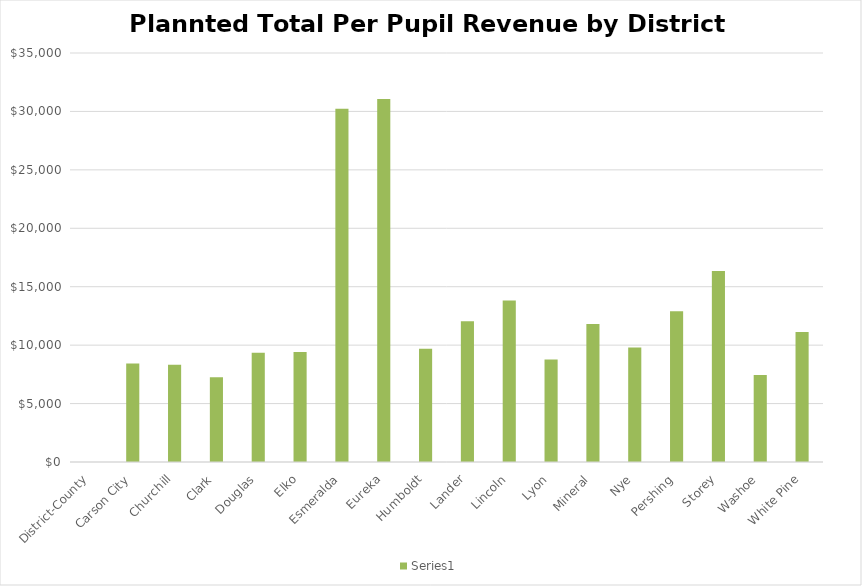
| Category | Series 2 |
|---|---|
| District-County | 1 |
| Carson City | 8429.382 |
| Churchill | 8326.49 |
| Clark | 7242.95 |
| Douglas | 9339.729 |
| Elko | 9420.39 |
| Esmeralda | 30219.264 |
| Eureka | 31067.775 |
| Humboldt | 9688.917 |
| Lander | 12053.339 |
| Lincoln | 13816.315 |
| Lyon | 8767.383 |
| Mineral | 11805.647 |
| Nye | 9793.716 |
| Pershing | 12894.414 |
| Storey | 16352.403 |
| Washoe | 7451.31 |
| White Pine | 11115.885 |